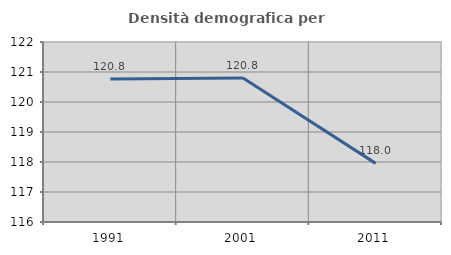
| Category | Densità demografica |
|---|---|
| 1991.0 | 120.767 |
| 2001.0 | 120.801 |
| 2011.0 | 117.954 |